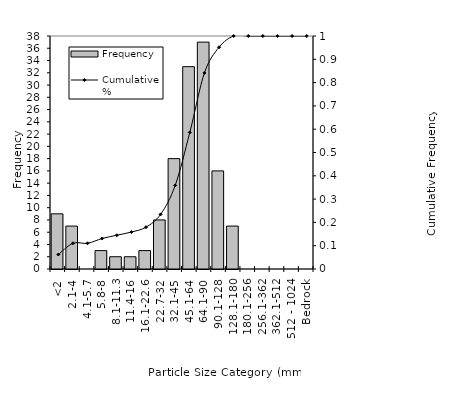
| Category | Frequency |
|---|---|
| <2 | 9 |
| 2.1-4 | 7 |
| 4.1-5.7 | 0 |
| 5.8-8 | 3 |
| 8.1-11.3 | 2 |
| 11.4-16 | 2 |
| 16.1-22.6 | 3 |
| 22.7-32 | 8 |
| 32.1-45 | 18 |
| 45.1-64 | 33 |
| 64.1-90 | 37 |
| 90.1-128 | 16 |
| 128.1-180 | 7 |
| 180.1-256 | 0 |
| 256.1-362 | 0 |
| 362.1-512 | 0 |
| 512 - 1024 | 0 |
| Bedrock | 0 |